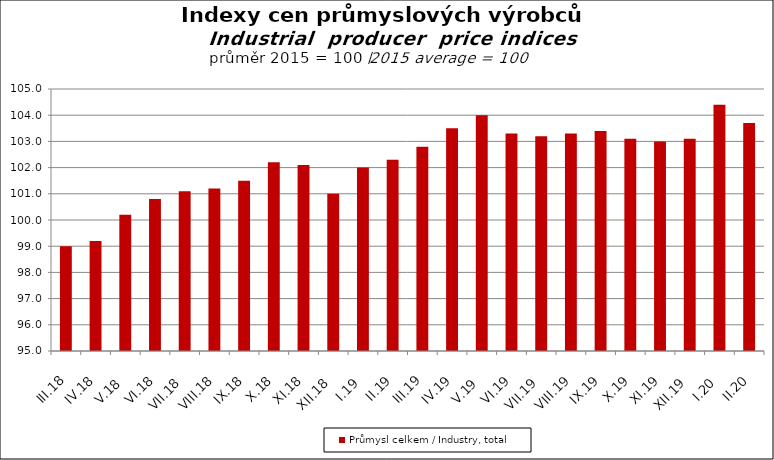
| Category | Průmysl celkem / Industry, total |
|---|---|
| III.18 | 99 |
| IV.18 | 99.2 |
| V.18 | 100.2 |
| VI.18 | 100.8 |
| VII.18 | 101.1 |
| VIII.18 | 101.2 |
| IX.18 | 101.5 |
| X.18 | 102.2 |
| XI.18 | 102.1 |
| XII.18 | 101 |
| I.19 | 102 |
| II.19 | 102.3 |
| III.19 | 102.8 |
| IV.19 | 103.5 |
| V.19 | 104 |
| VI.19 | 103.3 |
| VII.19 | 103.2 |
| VIII.19 | 103.3 |
| IX.19 | 103.4 |
| X.19 | 103.1 |
| XI.19 | 103 |
| XII.19 | 103.1 |
| I.20 | 104.4 |
| II.20 | 103.7 |